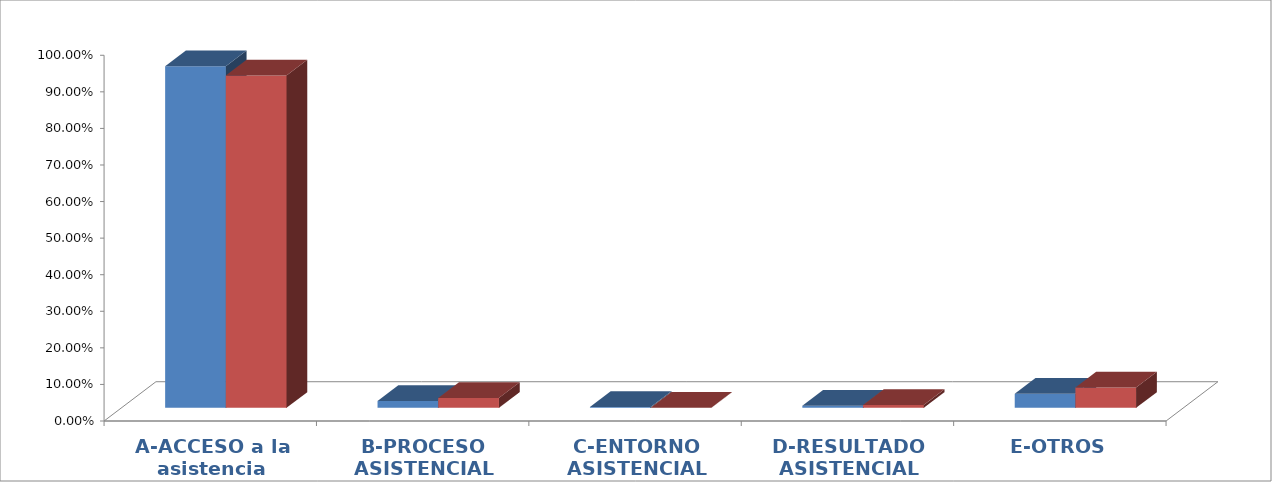
| Category | Series 0 | Series 1 |
|---|---|---|
| A-ACCESO a la asistencia | 0.934 | 0.909 |
| B-PROCESO ASISTENCIAL | 0.019 | 0.027 |
| C-ENTORNO ASISTENCIAL | 0.002 | 0 |
| D-RESULTADO ASISTENCIAL | 0.006 | 0.008 |
| E-OTROS | 0.039 | 0.056 |